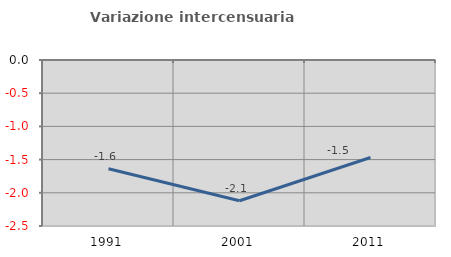
| Category | Variazione intercensuaria annua |
|---|---|
| 1991.0 | -1.639 |
| 2001.0 | -2.12 |
| 2011.0 | -1.468 |